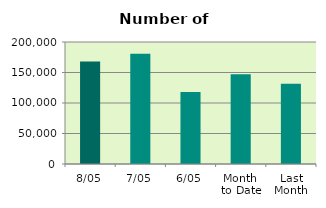
| Category | Series 0 |
|---|---|
| 8/05 | 168028 |
| 7/05 | 180762 |
| 6/05 | 118066 |
| Month 
to Date | 146984.8 |
| Last
Month | 131708.5 |